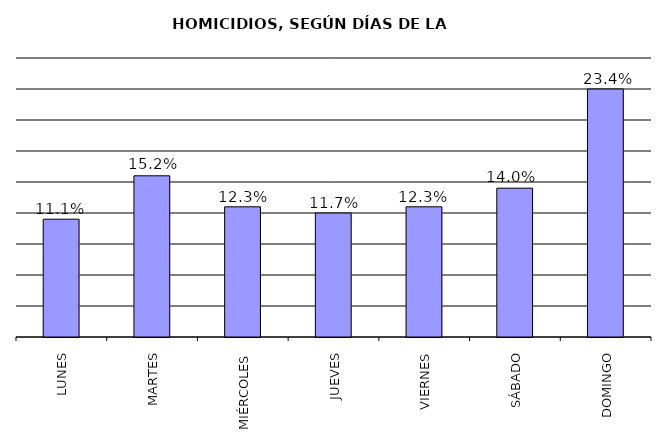
| Category | Series 0 |
|---|---|
| LUNES | 19 |
| MARTES | 26 |
| MIÉRCOLES | 21 |
| JUEVES | 20 |
| VIERNES | 21 |
| SÁBADO | 24 |
| DOMINGO | 40 |